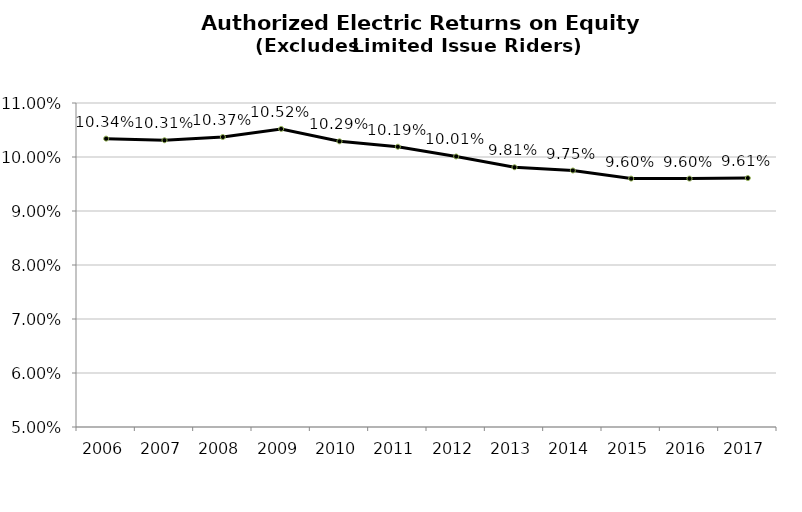
| Category | Series 2 |
|---|---|
| 2006 | 0.103 |
| 2007 | 0.103 |
| 2008 | 0.104 |
| 2009 | 0.105 |
| 2010 | 0.103 |
| 2011 | 0.102 |
| 2012 | 0.1 |
| 2013 | 0.098 |
| 2014 | 0.098 |
| 2015 | 0.096 |
| 2016 | 0.096 |
| 2017 | 0.096 |